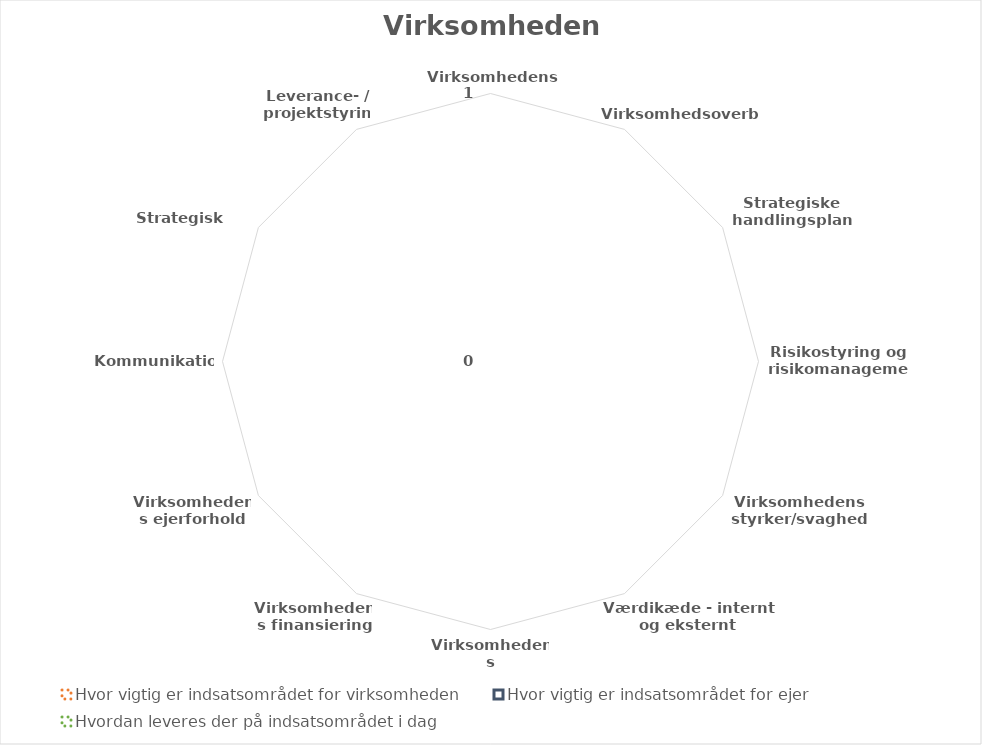
| Category | Hvor vigtig er indsatsområdet for virksomheden | Hvor vigtig er indsatsområdet for ejer | Hvordan leveres der på indsatsområdet i dag |
|---|---|---|---|
| Virksomhedens strategi | 0 | 0 | 0 |
| Virksomhedsoverblik | 0 | 0 | 0 |
| Strategiske handlingsplaner | 0 | 0 | 0 |
| Risikostyring og risikomanagement | 0 | 0 | 0 |
| Virksomhedens styrker/svagheder | 0 | 0 | 0 |
| Værdikæde - internt og eksternt | 0 | 0 | 0 |
| Virksomhedens bæredygtighed | 0 | 0 | 0 |
| Virksomhedens finansiering | 0 | 0 | 0 |
| Virksomhedens ejerforhold | 0 | 0 | 0 |
| Kommunikation | 0 | 0 | 0 |
| Strategisk sparring | 0 | 0 | 0 |
| Leverance- / projektstyring | 0 | 0 | 0 |